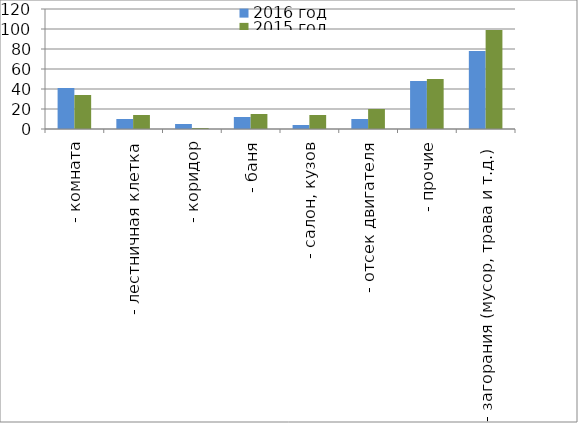
| Category | 2016 год | 2015 год |
|---|---|---|
|  - комната | 41 | 34 |
|  - лестничная клетка | 10 | 14 |
|  - коридор | 5 | 1 |
|  - баня | 12 | 15 |
|  - салон, кузов | 4 | 14 |
|  - отсек двигателя | 10 | 20 |
| - прочие | 48 | 50 |
| - загорания (мусор, трава и т.д.)  | 78 | 99 |